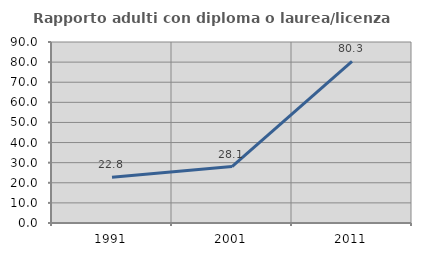
| Category | Rapporto adulti con diploma o laurea/licenza media  |
|---|---|
| 1991.0 | 22.774 |
| 2001.0 | 28.063 |
| 2011.0 | 80.317 |